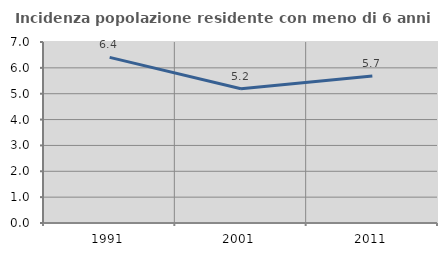
| Category | Incidenza popolazione residente con meno di 6 anni |
|---|---|
| 1991.0 | 6.405 |
| 2001.0 | 5.194 |
| 2011.0 | 5.69 |